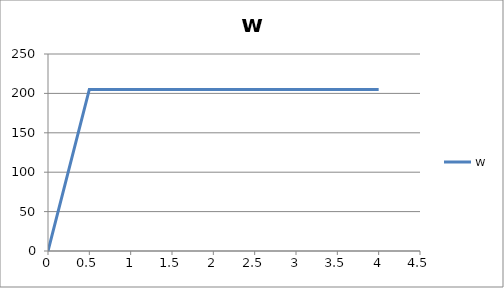
| Category | w |
|---|---|
| 0.0 | 0 |
| 0.5 | 205 |
| 0.5 | 205 |
| 4.0 | 205 |